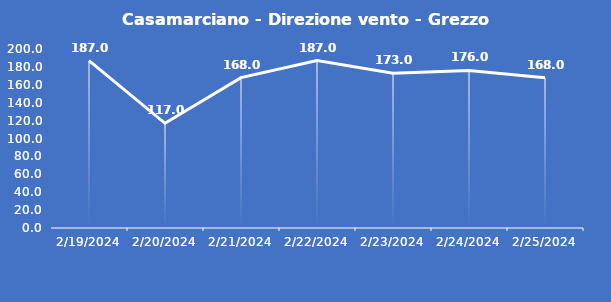
| Category | Casamarciano - Direzione vento - Grezzo (°N) |
|---|---|
| 2/19/24 | 187 |
| 2/20/24 | 117 |
| 2/21/24 | 168 |
| 2/22/24 | 187 |
| 2/23/24 | 173 |
| 2/24/24 | 176 |
| 2/25/24 | 168 |